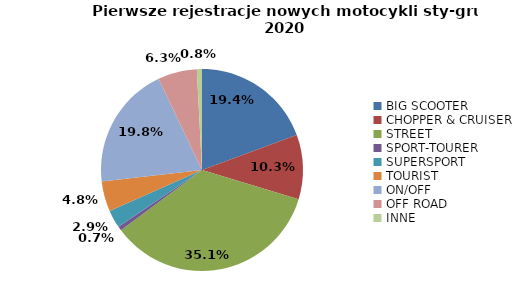
| Category | Series 0 |
|---|---|
| 0 | 4227 |
| 1 | 2251 |
| 2 | 7664 |
| 3 | 143 |
| 4 | 629 |
| 5 | 1050 |
| 6 | 4309 |
| 7 | 1364 |
| 8 | 178 |